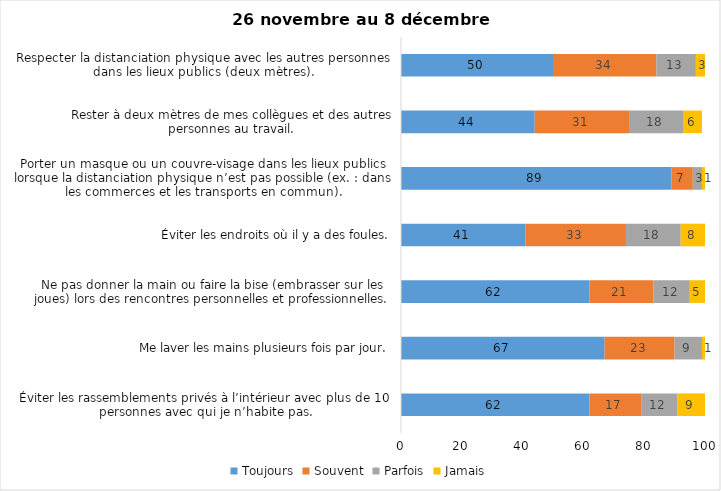
| Category | Toujours | Souvent | Parfois | Jamais |
|---|---|---|---|---|
| Éviter les rassemblements privés à l’intérieur avec plus de 10 personnes avec qui je n’habite pas. | 62 | 17 | 12 | 9 |
| Me laver les mains plusieurs fois par jour. | 67 | 23 | 9 | 1 |
| Ne pas donner la main ou faire la bise (embrasser sur les joues) lors des rencontres personnelles et professionnelles. | 62 | 21 | 12 | 5 |
| Éviter les endroits où il y a des foules. | 41 | 33 | 18 | 8 |
| Porter un masque ou un couvre-visage dans les lieux publics lorsque la distanciation physique n’est pas possible (ex. : dans les commerces et les transports en commun). | 89 | 7 | 3 | 1 |
| Rester à deux mètres de mes collègues et des autres personnes au travail. | 44 | 31 | 18 | 6 |
| Respecter la distanciation physique avec les autres personnes dans les lieux publics (deux mètres). | 50 | 34 | 13 | 3 |